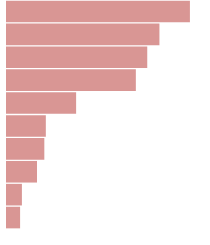
| Category | Series 0 |
|---|---|
| 0 | 18291817.2 |
| 1 | 15242265.6 |
| 2 | 14024001.6 |
| 3 | 12884420 |
| 4 | 6911465.6 |
| 5 | 3882492 |
| 6 | 3732244 |
| 7 | 2998353.6 |
| 8 | 1490737.6 |
| 9 | 1309564.8 |